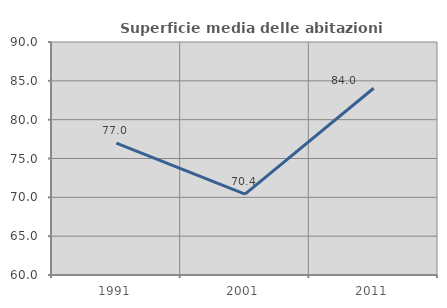
| Category | Superficie media delle abitazioni occupate |
|---|---|
| 1991.0 | 76.974 |
| 2001.0 | 70.405 |
| 2011.0 | 84.047 |